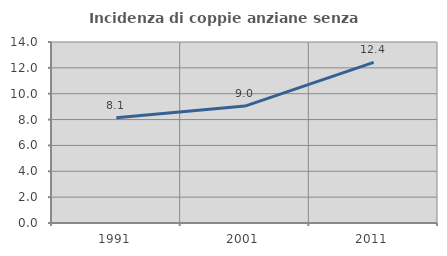
| Category | Incidenza di coppie anziane senza figli  |
|---|---|
| 1991.0 | 8.142 |
| 2001.0 | 9.045 |
| 2011.0 | 12.425 |